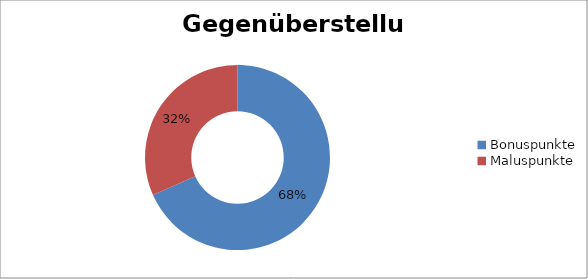
| Category | Series 0 |
|---|---|
| Bonuspunkte | 54 |
| Maluspunkte | 25 |